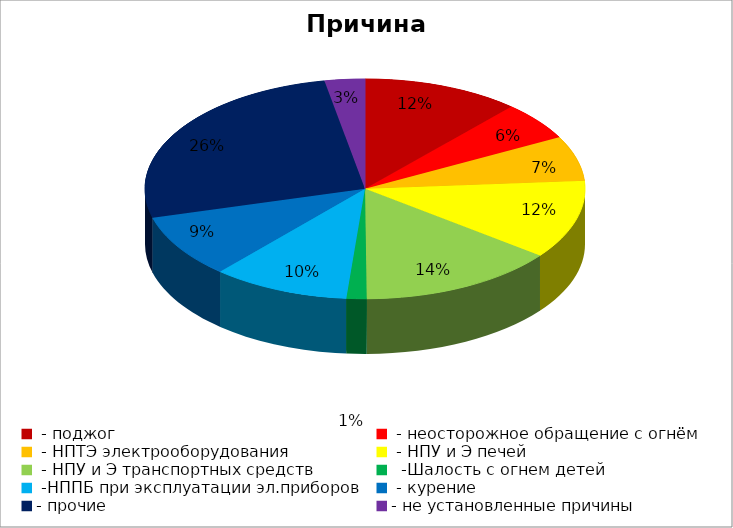
| Category | Причина пожара |
|---|---|
|  - поджог | 47 |
|  - неосторожное обращение с огнём | 23 |
|  - НПТЭ электрооборудования | 27 |
|  - НПУ и Э печей | 47 |
|  - НПУ и Э транспортных средств | 59 |
|   -Шалость с огнем детей | 6 |
|  -НППБ при эксплуатации эл.приборов | 41 |
|  - курение | 38 |
| - прочие | 107 |
| - не установленные причины | 12 |